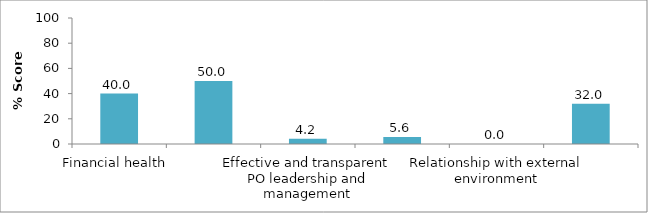
| Category | Series 0 |
|---|---|
| Financial health  | 40 |
| Engagement with output market | 50 |
| Effective and transparent PO leadership and management | 4.167 |
| Access to dairy/farm inputs and services | 5.556 |
| Relationship with external environment | 0 |
| Member loyalty | 32 |